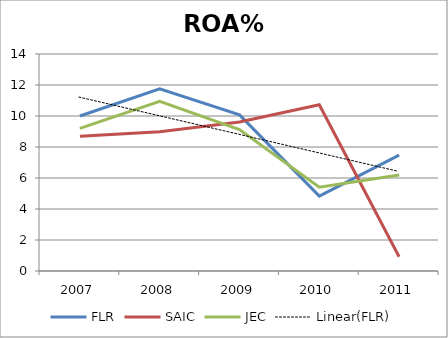
| Category | FLR | SAIC | JEC |
|---|---|---|---|
| 2007.0 | 10 | 8.7 | 9.2 |
| 2008.0 | 11.76 | 8.99 | 10.94 |
| 2009.0 | 10.07 | 9.61 | 9.13 |
| 2010.0 | 4.83 | 10.73 | 5.41 |
| 2011.0 | 7.48 | 0.92 | 6.19 |